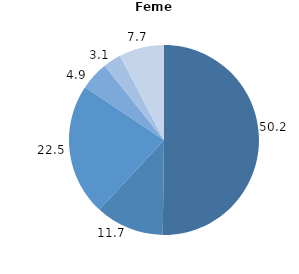
| Category | Series 0 |
|---|---|
| 0 | 50.21 |
| 1 | 11.704 |
| 2 | 22.475 |
| 3 | 4.87 |
| 4 | 3.07 |
| 5 | 7.672 |